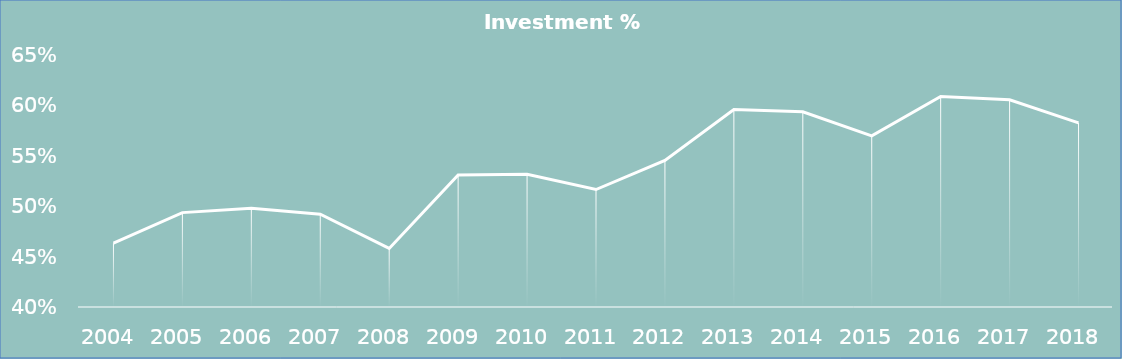
| Category | Series 0 |
|---|---|
| 2004.0 | 0.463 |
| 2005.0 | 0.493 |
| 2006.0 | 0.497 |
| 2007.0 | 0.492 |
| 2008.0 | 0.458 |
| 2009.0 | 0.53 |
| 2010.0 | 0.531 |
| 2011.0 | 0.516 |
| 2012.0 | 0.545 |
| 2013.0 | 0.595 |
| 2014.0 | 0.593 |
| 2015.0 | 0.569 |
| 2016.0 | 0.608 |
| 2017.0 | 0.605 |
| 2018.0 | 0.582 |